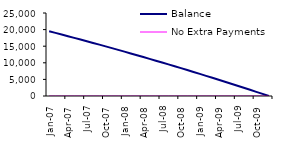
| Category | Balance | No Extra Payments |
|---|---|---|
| 2007-01-01 | 19510.32 | 19510.317 |
| 2007-02-01 | 19017.17 | 19017.165 |
| 2007-03-01 | 18520.52 | 18520.52 |
| 2007-04-01 | 18020.36 | 18020.357 |
| 2007-05-01 | 17516.65 | 17516.651 |
| 2007-06-01 | 17009.38 | 17009.377 |
| 2007-07-01 | 16498.51 | 16498.51 |
| 2007-08-01 | 15984.02 | 15984.025 |
| 2007-09-01 | 15465.89 | 15465.895 |
| 2007-10-01 | 14944.09 | 14944.095 |
| 2007-11-01 | 14418.59 | 14418.599 |
| 2007-12-01 | 13889.37 | 13889.381 |
| 2008-01-01 | 13356.4 | 13356.414 |
| 2008-02-01 | 12819.66 | 12819.672 |
| 2008-03-01 | 12279.12 | 12279.128 |
| 2008-04-01 | 11734.75 | 11734.755 |
| 2008-05-01 | 11186.52 | 11186.526 |
| 2008-06-01 | 10634.41 | 10634.414 |
| 2008-07-01 | 10078.39 | 10078.391 |
| 2008-08-01 | 9518.43 | 9518.43 |
| 2008-09-01 | 8954.5 | 8954.502 |
| 2008-10-01 | 8386.58 | 8386.58 |
| 2008-11-01 | 7814.63 | 7814.635 |
| 2008-12-01 | 7238.63 | 7238.638 |
| 2009-01-01 | 6658.55 | 6658.562 |
| 2009-02-01 | 6074.36 | 6074.377 |
| 2009-03-01 | 5486.04 | 5486.054 |
| 2009-04-01 | 4893.55 | 4893.563 |
| 2009-05-01 | 4296.86 | 4296.876 |
| 2009-06-01 | 3695.95 | 3695.962 |
| 2009-07-01 | 3090.78 | 3090.792 |
| 2009-08-01 | 2481.32 | 2481.335 |
| 2009-09-01 | 1867.55 | 1867.561 |
| 2009-10-01 | 1249.43 | 1249.44 |
| 2009-11-01 | 626.93 | 626.94 |
| 2009-12-01 | 0 | 0.031 |